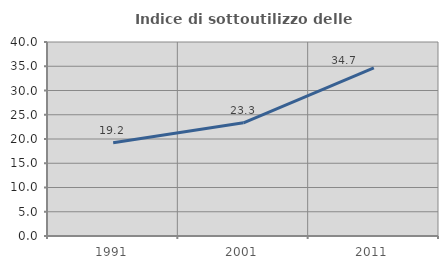
| Category | Indice di sottoutilizzo delle abitazioni  |
|---|---|
| 1991.0 | 19.222 |
| 2001.0 | 23.336 |
| 2011.0 | 34.669 |